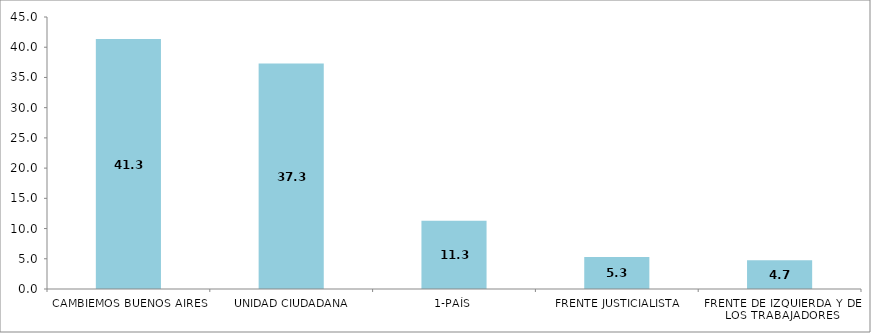
| Category | Listas |
|---|---|
| CAMBIEMOS BUENOS AIRES | 41.35 |
| UNIDAD CIUDADANA | 37.306 |
| 1-PAÍS | 11.306 |
| FRENTE JUSTICIALISTA | 5.294 |
| FRENTE DE IZQUIERDA Y DE LOS TRABAJADORES | 4.745 |